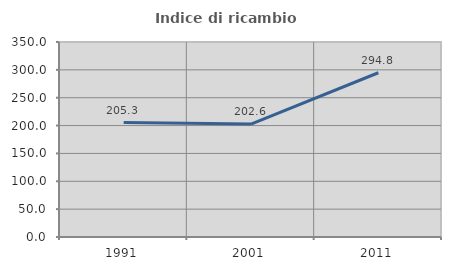
| Category | Indice di ricambio occupazionale  |
|---|---|
| 1991.0 | 205.333 |
| 2001.0 | 202.6 |
| 2011.0 | 294.828 |